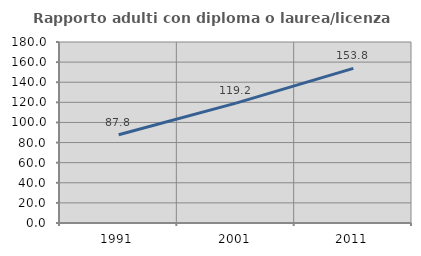
| Category | Rapporto adulti con diploma o laurea/licenza media  |
|---|---|
| 1991.0 | 87.79 |
| 2001.0 | 119.204 |
| 2011.0 | 153.794 |